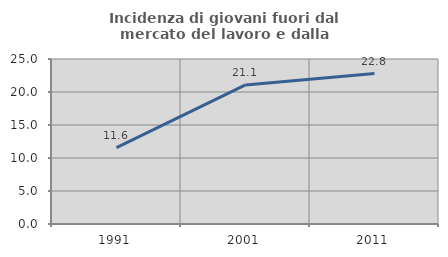
| Category | Incidenza di giovani fuori dal mercato del lavoro e dalla formazione  |
|---|---|
| 1991.0 | 11.578 |
| 2001.0 | 21.076 |
| 2011.0 | 22.794 |